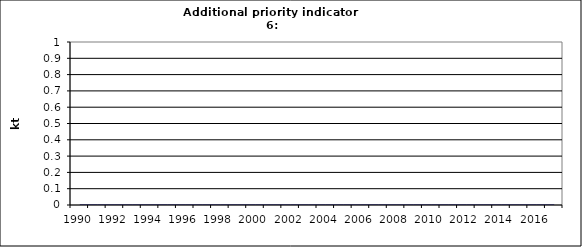
| Category | Cement production, kt |
|---|---|
| 1990 | 0 |
| 1991 | 0 |
| 1992 | 0 |
| 1993 | 0 |
| 1994 | 0 |
| 1995 | 0 |
| 1996 | 0 |
| 1997 | 0 |
| 1998 | 0 |
| 1999 | 0 |
| 2000 | 0 |
| 2001 | 0 |
| 2002 | 0 |
| 2003 | 0 |
| 2004 | 0 |
| 2005 | 0 |
| 2006 | 0 |
| 2007 | 0 |
| 2008 | 0 |
| 2009 | 0 |
| 2010 | 0 |
| 2011 | 0 |
| 2012 | 0 |
| 2013 | 0 |
| 2014 | 0 |
| 2015 | 0 |
| 2016 | 0 |
| 2017 | 0 |